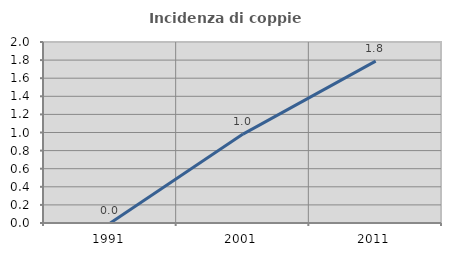
| Category | Incidenza di coppie miste |
|---|---|
| 1991.0 | 0 |
| 2001.0 | 0.982 |
| 2011.0 | 1.789 |